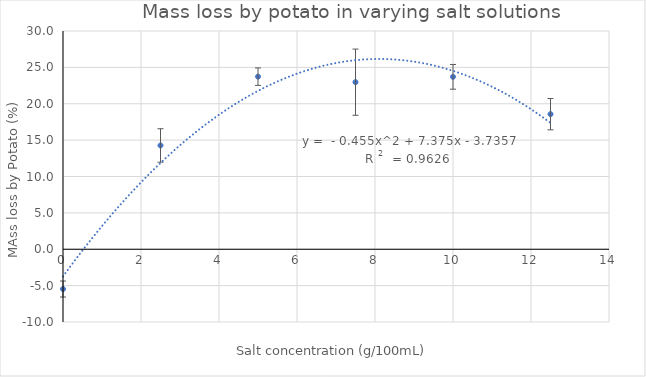
| Category | Series 0 |
|---|---|
| 0.0 | -5.467 |
| 2.5 | 14.267 |
| 5.0 | 23.725 |
| 7.5 | 22.967 |
| 10.0 | 23.7 |
| 12.5 | 18.567 |